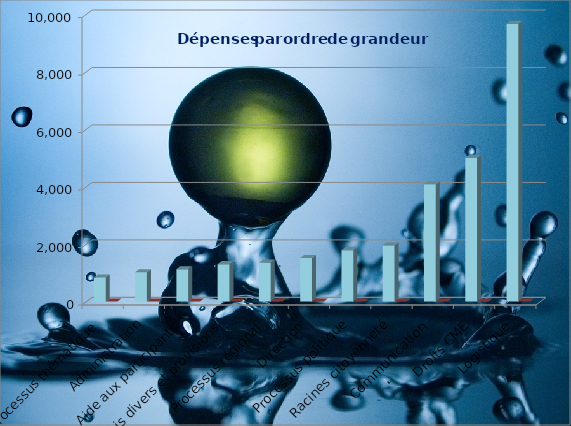
| Category | Series 0 | Series 1 |
|---|---|---|
| Processus thématique | 838 | 0.028 |
| Administration | 1020 | 0.034 |
| Aide aux participants | 1125 | 0.038 |
| Frais divers et provisions | 1300 | 0.044 |
| Processus régional | 1353 | 0.046 |
| Direction | 1513 | 0.051 |
| Processus politique | 1788 | 0.06 |
| Racines citoyenneté | 1950 | 0.066 |
| Communication | 4080 | 0.138 |
| Droits CME | 5000 | 0.169 |
| Logistique | 9665 | 0.326 |